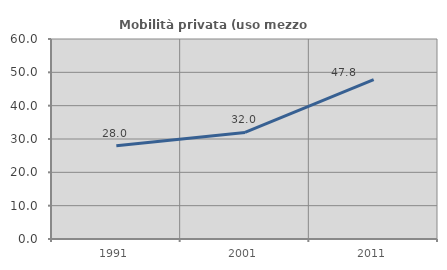
| Category | Mobilità privata (uso mezzo privato) |
|---|---|
| 1991.0 | 27.965 |
| 2001.0 | 31.963 |
| 2011.0 | 47.783 |